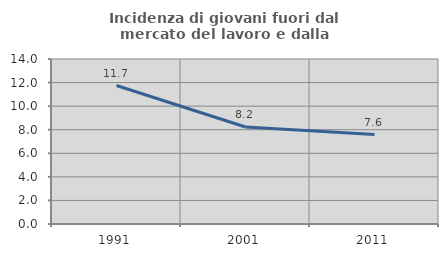
| Category | Incidenza di giovani fuori dal mercato del lavoro e dalla formazione  |
|---|---|
| 1991.0 | 11.749 |
| 2001.0 | 8.23 |
| 2011.0 | 7.589 |